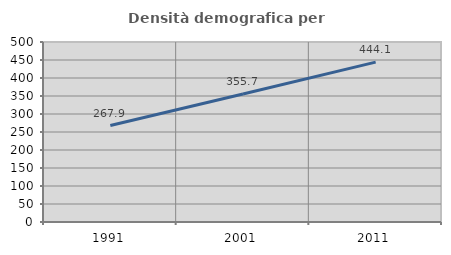
| Category | Densità demografica |
|---|---|
| 1991.0 | 267.942 |
| 2001.0 | 355.668 |
| 2011.0 | 444.075 |